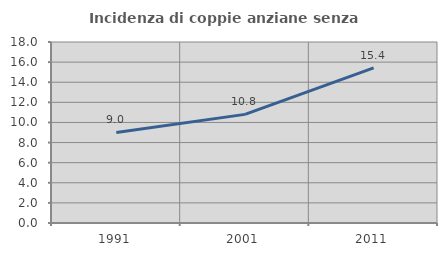
| Category | Incidenza di coppie anziane senza figli  |
|---|---|
| 1991.0 | 9.009 |
| 2001.0 | 10.802 |
| 2011.0 | 15.433 |